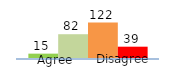
| Category | Series 0 | Series 1 | Series 2 | Series 3 |
|---|---|---|---|---|
| 0 | 15 | 82 | 122 | 39 |